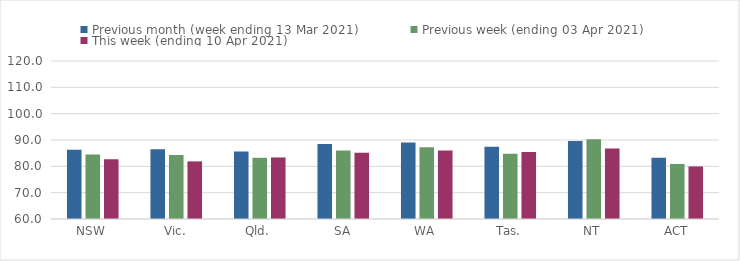
| Category | Previous month (week ending 13 Mar 2021) | Previous week (ending 03 Apr 2021) | This week (ending 10 Apr 2021) |
|---|---|---|---|
| NSW | 86.26 | 84.46 | 82.69 |
| Vic. | 86.52 | 84.31 | 81.88 |
| Qld. | 85.61 | 83.24 | 83.37 |
| SA | 88.45 | 86.01 | 85.2 |
| WA | 89.03 | 87.22 | 86.02 |
| Tas. | 87.48 | 84.82 | 85.45 |
| NT | 89.59 | 90.24 | 86.76 |
| ACT | 83.26 | 80.9 | 79.96 |